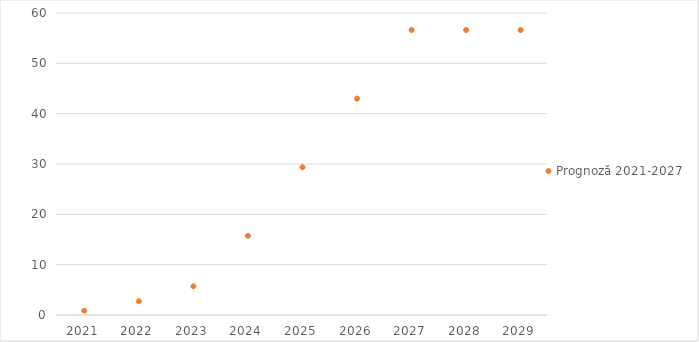
| Category | Prognoză 2021-2027 |
|---|---|
| 2021.0 | 0.867 |
| 2022.0 | 2.726 |
| 2023.0 | 5.699 |
| 2024.0 | 15.735 |
| 2025.0 | 29.363 |
| 2026.0 | 42.991 |
| 2027.0 | 56.62 |
| 2028.0 | 56.62 |
| 2029.0 | 56.62 |